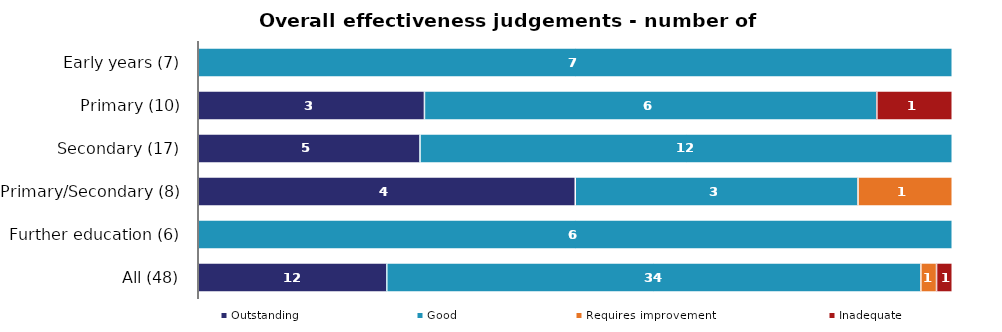
| Category | Outstanding | Good | Requires improvement | Inadequate |
|---|---|---|---|---|
| Early years (7) | 0 | 7 | 0 | 0 |
| Primary (10) | 3 | 6 | 0 | 1 |
| Secondary (17) | 5 | 12 | 0 | 0 |
| Primary/Secondary (8) | 4 | 3 | 1 | 0 |
| Further education (6) | 0 | 6 | 0 | 0 |
| All (48) | 12 | 34 | 1 | 1 |